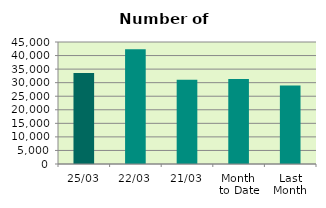
| Category | Series 0 |
|---|---|
| 25/03 | 33550 |
| 22/03 | 42332 |
| 21/03 | 31050 |
| Month 
to Date | 31397.529 |
| Last
Month | 28915.6 |